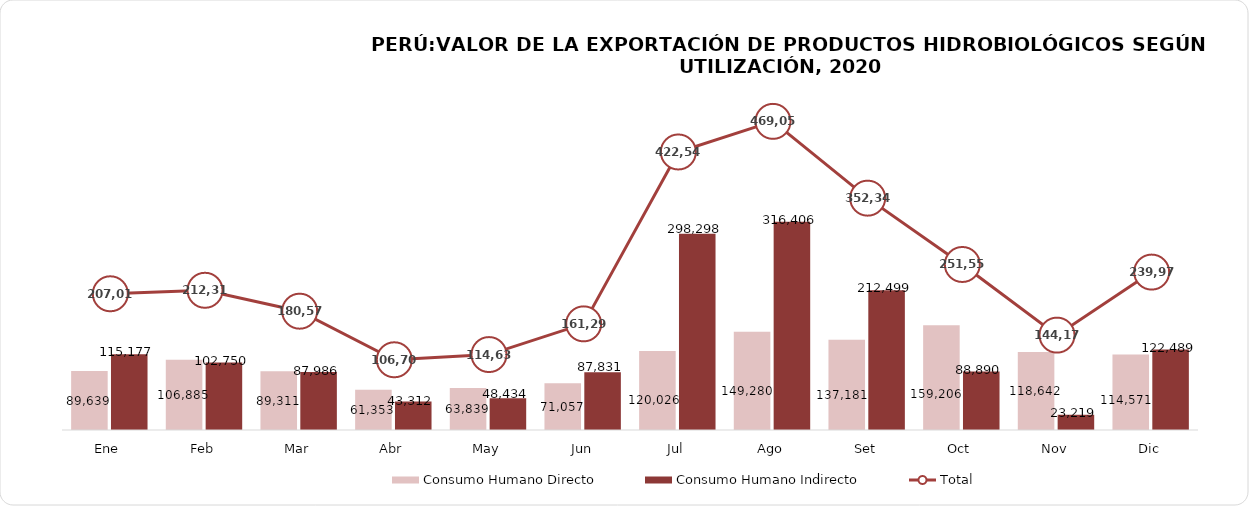
| Category | Consumo Humano Directo | Consumo Humano Indirecto |
|---|---|---|
| Ene | 89639.299 | 115176.847 |
| Feb | 106884.624 | 102749.611 |
| Mar | 89310.536 | 87986.17 |
| Abr | 61352.874 | 43312.438 |
| May | 63839.062 | 48434.136 |
| Jun | 71057.139 | 87831.022 |
| Jul | 120025.745 | 298297.976 |
| Ago | 149280.044 | 316406.244 |
| Set | 137181.235 | 212498.809 |
| Oct | 159205.879 | 88889.749 |
| Nov | 118641.932 | 23218.645 |
| Dic | 114570.666 | 122489.247 |